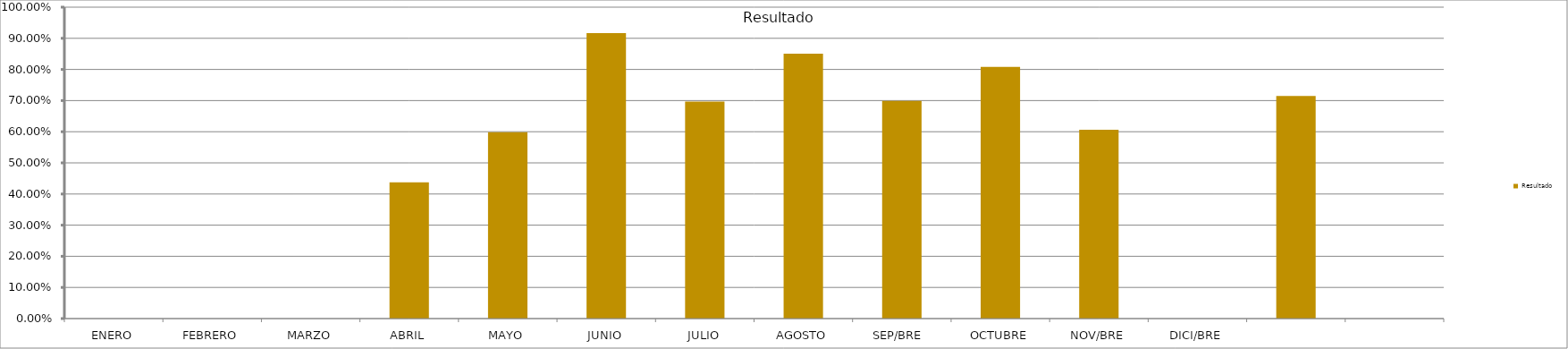
| Category | Resultado  |
|---|---|
| ENERO | 0 |
| FEBRERO | 0 |
| MARZO | 0 |
| ABRIL | 0.437 |
| MAYO | 0.599 |
| JUNIO | 0.917 |
| JULIO | 0.697 |
| AGOSTO | 0.851 |
| SEP/BRE  | 0.699 |
| OCTUBRE | 0.808 |
| NOV/BRE | 0.606 |
| DICI/BRE | 0 |